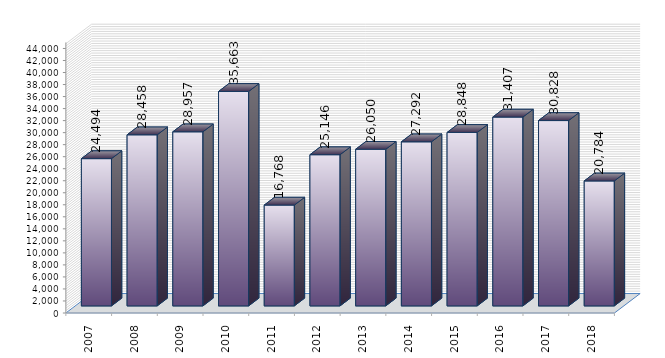
| Category | rok subsydia |
|---|---|
| 0 | 24494 |
| 1 | 28458 |
| 2 | 28957 |
| 3 | 35663 |
| 4 | 16768 |
| 5 | 25146 |
| 6 | 26050 |
| 7 | 27292 |
| 8 | 28848 |
| 9 | 31407 |
| 10 | 30828 |
| 11 | 20784 |